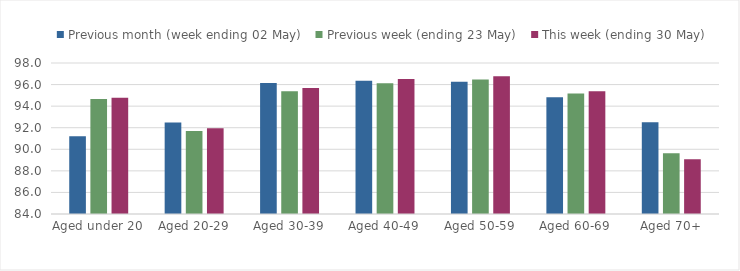
| Category | Previous month (week ending 02 May) | Previous week (ending 23 May) | This week (ending 30 May) |
|---|---|---|---|
| Aged under 20 | 91.211 | 94.662 | 94.78 |
| Aged 20-29 | 92.48 | 91.705 | 91.957 |
| Aged 30-39 | 96.157 | 95.391 | 95.69 |
| Aged 40-49 | 96.346 | 96.127 | 96.512 |
| Aged 50-59 | 96.25 | 96.459 | 96.774 |
| Aged 60-69 | 94.821 | 95.184 | 95.37 |
| Aged 70+ | 92.505 | 89.632 | 89.077 |